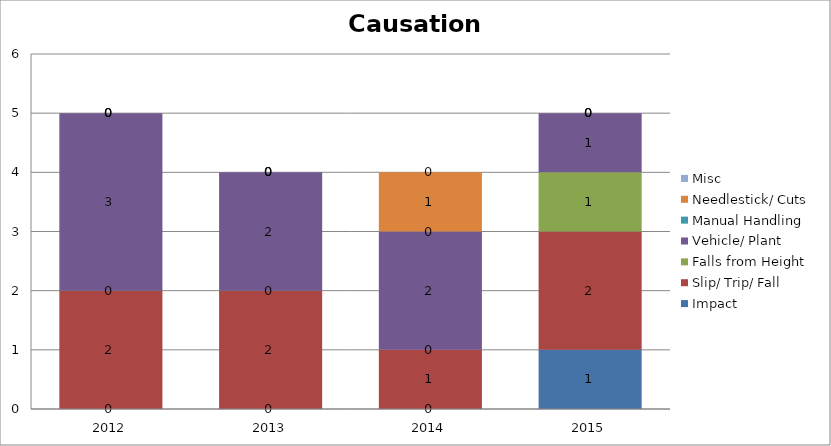
| Category | Impact | Slip/ Trip/ Fall | Falls from Height | Vehicle/ Plant | Manual Handling | Needlestick/ Cuts  | Misc |
|---|---|---|---|---|---|---|---|
| 2012.0 | 0 | 2 | 0 | 3 | 0 | 0 | 0 |
| 2013.0 | 0 | 2 | 0 | 2 | 0 | 0 | 0 |
| 2014.0 | 0 | 1 | 0 | 2 | 0 | 1 | 0 |
| 2015.0 | 1 | 2 | 1 | 1 | 0 | 0 | 0 |